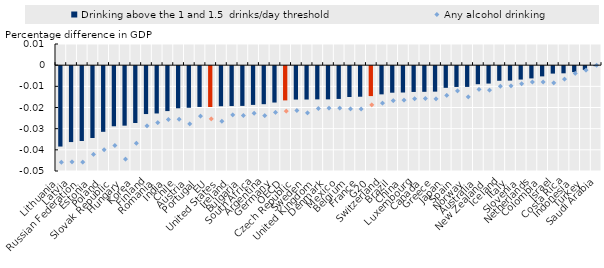
| Category | Drinking above the 1 and 1.5  drinks/day threshold |
|---|---|
| Lithuania | -0.038 |
| Latvia | -0.036 |
| Russian Federation | -0.035 |
| Estonia | -0.034 |
| Poland | -0.031 |
| Slovak Republic | -0.028 |
| Hungary | -0.028 |
| Korea | -0.027 |
| Finland | -0.023 |
| Romania | -0.022 |
| India | -0.021 |
| Chile | -0.02 |
| Austria | -0.02 |
| Portugal | -0.019 |
| EU | -0.019 |
| United States | -0.019 |
| Ireland | -0.019 |
| Bulgaria | -0.019 |
| South Africa | -0.018 |
| Argentina | -0.018 |
| Germany | -0.017 |
| OECD | -0.016 |
| Czech Republic | -0.016 |
| Sweden | -0.016 |
| United Kingdom | -0.016 |
| Denmark | -0.016 |
| Mexico | -0.015 |
| Belgium | -0.015 |
| France | -0.014 |
| G20 | -0.014 |
| Switzerland | -0.013 |
| Brazil | -0.013 |
| China | -0.012 |
| Luxembourg | -0.012 |
| Canada | -0.012 |
| Greece | -0.012 |
| Japan | -0.01 |
| Spain | -0.01 |
| Norway | -0.01 |
| Australia | -0.009 |
| New Zealand | -0.008 |
| Iceland | -0.007 |
| Italy | -0.007 |
| Slovenia | -0.006 |
| Netherlands | -0.006 |
| Colombia | -0.005 |
| Israel | -0.004 |
| Costa Rica | -0.003 |
| Indonesia | -0.003 |
| Turkey | -0.002 |
| Saudi Arabia | 0 |